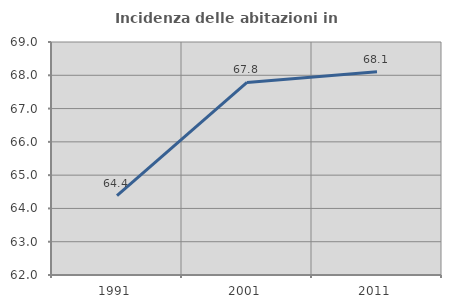
| Category | Incidenza delle abitazioni in proprietà  |
|---|---|
| 1991.0 | 64.384 |
| 2001.0 | 67.785 |
| 2011.0 | 68.11 |